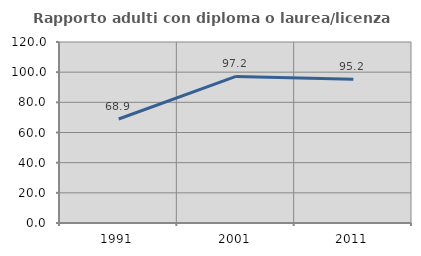
| Category | Rapporto adulti con diploma o laurea/licenza media  |
|---|---|
| 1991.0 | 68.943 |
| 2001.0 | 97.198 |
| 2011.0 | 95.229 |